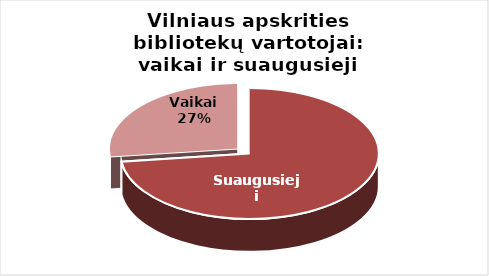
| Category | Series 0 |
|---|---|
| Suaugusieji | 78105 |
| Vaikai | 28869 |